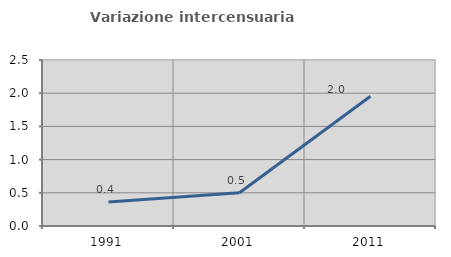
| Category | Variazione intercensuaria annua |
|---|---|
| 1991.0 | 0.362 |
| 2001.0 | 0.5 |
| 2011.0 | 1.954 |